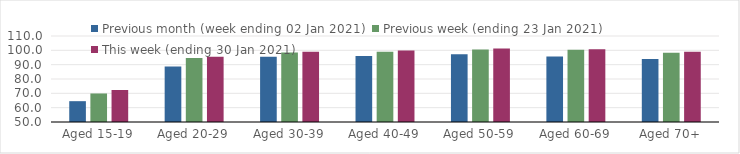
| Category | Previous month (week ending 02 Jan 2021) | Previous week (ending 23 Jan 2021) | This week (ending 30 Jan 2021) |
|---|---|---|---|
| Aged 15-19 | 64.53 | 69.9 | 72.33 |
| Aged 20-29 | 88.72 | 94.67 | 95.45 |
| Aged 30-39 | 95.44 | 98.44 | 99.09 |
| Aged 40-49 | 96.05 | 99.04 | 99.86 |
| Aged 50-59 | 97.21 | 100.5 | 101.27 |
| Aged 60-69 | 95.65 | 100.32 | 100.74 |
| Aged 70+ | 93.98 | 98.33 | 98.95 |